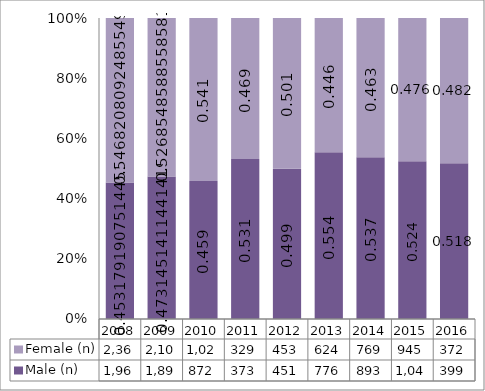
| Category | Male (n) | Female (n) |
|---|---|---|
| 2008.0 | 1960 | 2365 |
| 2009.0 | 1894 | 2109 |
| 2010.0 | 872 | 1029 |
| 2011.0 | 373 | 329 |
| 2012.0 | 451 | 453 |
| 2013.0 | 776 | 624 |
| 2014.0 | 893 | 769 |
| 2015.0 | 1042 | 945 |
| 2016.0 | 399 | 372 |